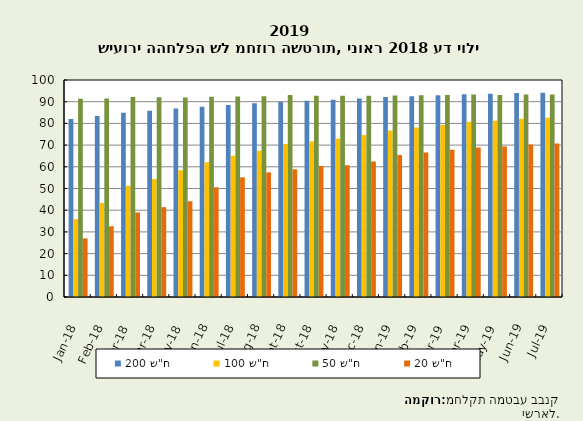
| Category | 200 ש"ח  | 100 ש"ח  | 50 ש"ח  | 20 ש"ח  |
|---|---|---|---|---|
| 2018-01-01 | 82.051 | 35.875 | 91.346 | 27.005 |
| 2018-02-01 | 83.431 | 43.311 | 91.526 | 32.585 |
| 2018-03-01 | 84.933 | 51.252 | 92.127 | 38.975 |
| 2018-04-01 | 85.792 | 54.391 | 92.069 | 41.397 |
| 2018-05-01 | 86.914 | 58.42 | 91.886 | 44.124 |
| 2018-06-01 | 87.642 | 62.084 | 92.287 | 50.553 |
| 2018-07-01 | 88.523 | 65.055 | 92.418 | 55.156 |
| 2018-08-01 | 89.288 | 67.377 | 92.545 | 57.434 |
| 2018-09-01 | 89.851 | 70.554 | 93.052 | 58.848 |
| 2018-10-01 | 90.381 | 71.65 | 92.757 | 60.355 |
| 2018-11-01 | 90.89 | 72.972 | 92.7 | 60.729 |
| 2018-12-01 | 91.494 | 74.704 | 92.791 | 62.453 |
| 2019-01-01 | 92.146 | 76.698 | 92.803 | 65.38 |
| 2019-02-01 | 92.553 | 78.098 | 92.925 | 66.541 |
| 2019-03-01 | 92.954 | 79.298 | 93.087 | 67.9 |
| 2019-04-01 | 93.402 | 80.817 | 93.276 | 68.912 |
| 2019-05-01 | 93.633 | 81.219 | 93.049 | 69.335 |
| 2019-06-01 | 93.968 | 82.178 | 93.367 | 70.281 |
| 2019-07-01 | 94.168 | 82.552 | 93.29 | 70.696 |